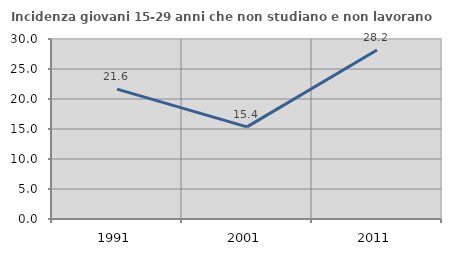
| Category | Incidenza giovani 15-29 anni che non studiano e non lavorano  |
|---|---|
| 1991.0 | 21.637 |
| 2001.0 | 15.358 |
| 2011.0 | 28.159 |